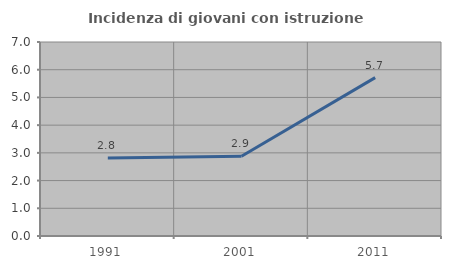
| Category | Incidenza di giovani con istruzione universitaria |
|---|---|
| 1991.0 | 2.817 |
| 2001.0 | 2.878 |
| 2011.0 | 5.714 |